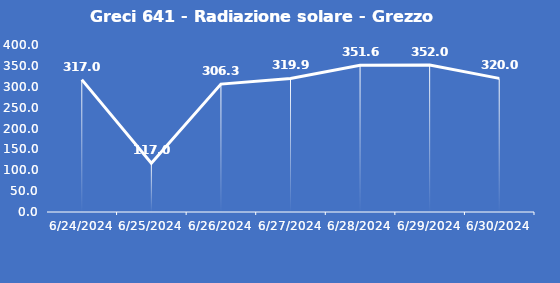
| Category | Greci 641 - Radiazione solare - Grezzo (W/m2) |
|---|---|
| 6/24/24 | 317 |
| 6/25/24 | 117 |
| 6/26/24 | 306.3 |
| 6/27/24 | 319.9 |
| 6/28/24 | 351.6 |
| 6/29/24 | 352 |
| 6/30/24 | 320 |